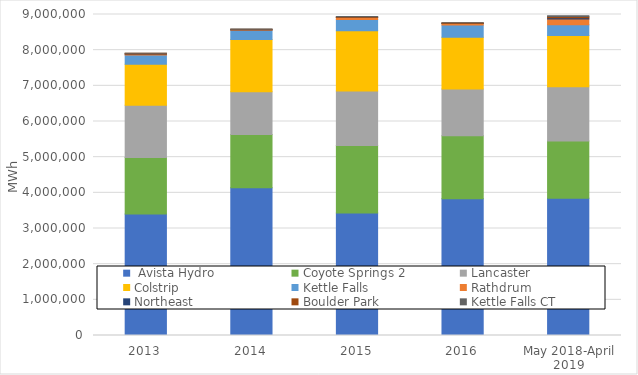
| Category |  Avista Hydro | Coyote Springs 2 | Lancaster | Colstrip | Kettle Falls | Rathdrum | Northeast | Boulder Park | Kettle Falls CT |
|---|---|---|---|---|---|---|---|---|---|
| 2013 | 3404000 | 1584267 | 1469608 | 1145503 | 260245 | 25685 | 173 | 21534 | 5120 |
| 2014 | 4143307 | 1494579 | 1194990 | 1464025 | 259377 | 12789 | 2431 | 14811 | 4066 |
| 2015 | 3434549 | 1891969 | 1525436 | 1689986 | 320517 | 52558 | 1073 | 22428 | 4141 |
| 2016 | 3836116 | 1765406 | 1307452 | 1455836 | 341370 | 40615 | 1087 | 18358 | 3468 |
| May 2018-April 2019 | 3845000 | 1606000 | 1523000 | 1434000 | 308000 | 161000 | 35000 | 31000 | 23000 |